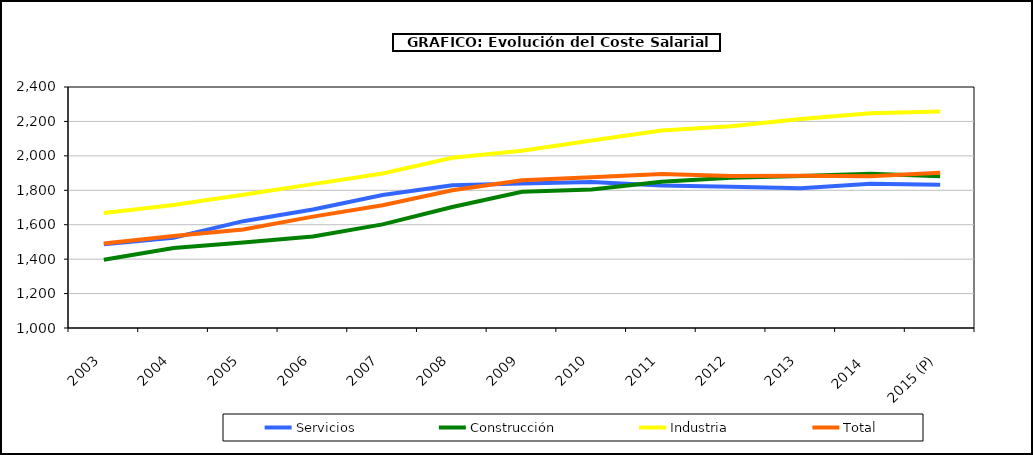
| Category | Servicios | Construcción | Industria | Total |
|---|---|---|---|---|
|  2003 | 1486.84 | 1396.555 | 1668.615 | 1490.318 |
|  2004 | 1524.1 | 1464.175 | 1715.052 | 1533.81 |
|  2005 | 1620.663 | 1496.465 | 1774.282 | 1571.99 |
|  2006 | 1688.575 | 1532.018 | 1835.688 | 1646.96 |
|  2007 | 1772.288 | 1602.058 | 1897.902 | 1713.16 |
|  2008 | 1829.705 | 1703.245 | 1989.208 | 1800.028 |
|  2009 | 1838.732 | 1791.185 | 2030.235 | 1857.978 |
|  2010 | 1848.135 | 1804.735 | 2088.605 | 1875.23 |
|  2011 | 1827.48 | 1849.53 | 2147.29 | 1894.842 |
|  2012 | 1820.002 | 1872.792 | 2172.148 | 1883.54 |
|  2013 | 1811.798 | 1882.945 | 2214.01 | 1883.76 |
|  2014  | 1837.24 | 1895.448 | 2247.635 | 1881.91 |
|  2015 (P) | 1832.052 | 1882.23 | 2257.03 | 1902.37 |